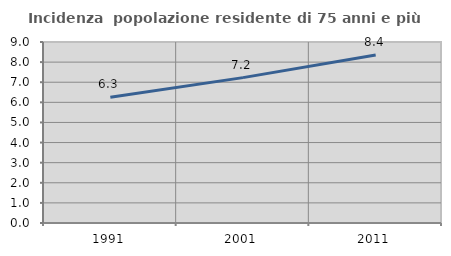
| Category | Incidenza  popolazione residente di 75 anni e più |
|---|---|
| 1991.0 | 6.251 |
| 2001.0 | 7.229 |
| 2011.0 | 8.356 |